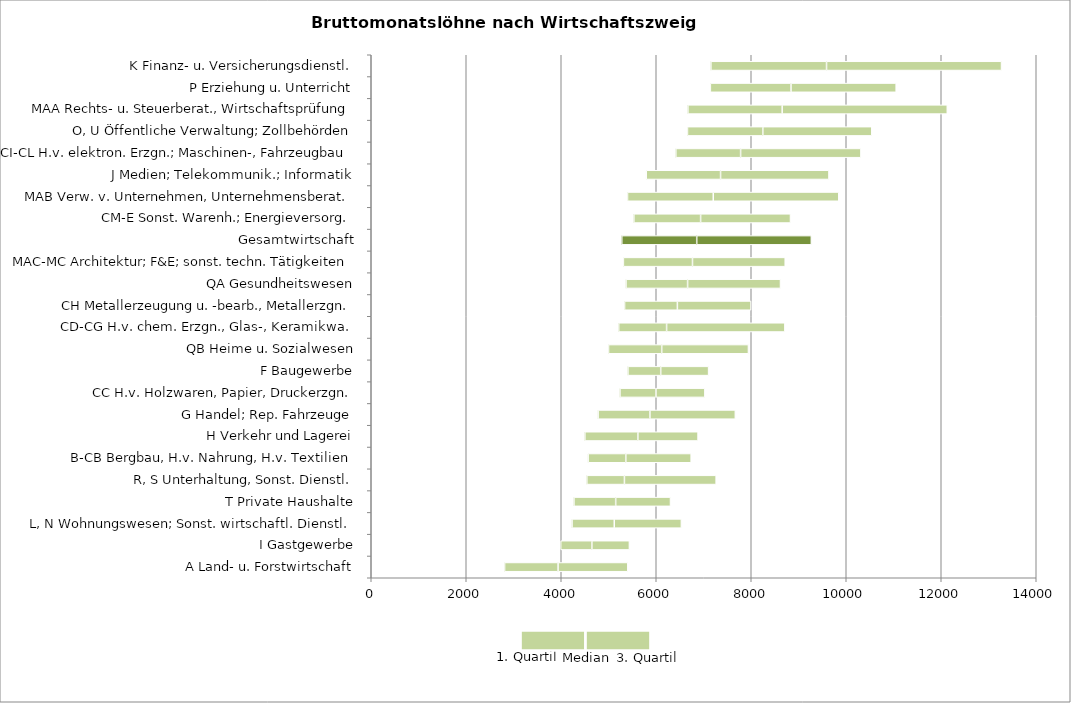
| Category | Series 0 | Series 1 | Series 2 |
|---|---|---|---|
| A Land- u. Forstwirtschaft | 2807 | 1126 | 1468 |
| I Gastgewerbe | 3988 | 657 | 790 |
| L, N Wohnungswesen; Sonst. wirtschaftl. Dienstl. | 4227 | 889 | 1413 |
| T Private Haushalte | 4267 | 879 | 1154 |
| R, S Unterhaltung, Sonst. Dienstl. | 4538 | 792 | 1931 |
| B-CB Bergbau, H.v. Nahrung, H.v. Textilien | 4566 | 793 | 1376 |
| H Verkehr und Lagerei | 4497 | 1116 | 1267 |
| G Handel; Rep. Fahrzeuge | 4776 | 1091 | 1798 |
| CC H.v. Holzwaren, Papier, Druckerzgn. | 5236 | 758 | 1030 |
| F Baugewerbe | 5403 | 691 | 1008 |
| QB Heime u. Sozialwesen | 4995 | 1120 | 1826 |
| CD-CG H.v. chem. Erzgn., Glas-, Keramikwa. | 5209 | 1009 | 2490 |
| CH Metallerzeugung u. -bearb., Metallerzgn. | 5333 | 1112 | 1551 |
| QA Gesundheitswesen | 5363 | 1297 | 1956 |
| MAC-MC Architektur; F&E; sonst. techn. Tätigkeiten | 5308 | 1455 | 1952 |
| Gesamtwirtschaft | 5274 | 1578 | 2413 |
| CM-E Sonst. Warenh.; Energieversorg. | 5528 | 1406 | 1892 |
| MAB Verw. v. Unternehmen, Unternehmensberat. | 5395 | 1805 | 2643 |
| J Medien; Telekommunik.; Informatik | 5789 | 1565 | 2282 |
| CI-CL H.v. elektron. Erzgn.; Maschinen-, Fahrzeugbau | 6412 | 1364 | 2533 |
| O, U Öffentliche Verwaltung; Zollbehörden | 6657 | 1587 | 2294 |
| MAA Rechts- u. Steuerberat., Wirtschaftsprüfung | 6666 | 1985 | 3476 |
| P Erziehung u. Unterricht | 7139 | 1698 | 2214 |
| K Finanz- u. Versicherungsdienstl. | 7150 | 2435 | 3684 |